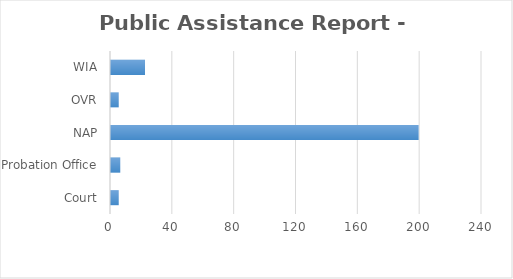
| Category | Series 0 |
|---|---|
| Court | 5 |
| Probation Office | 6 |
| NAP | 199 |
| OVR | 5 |
| WIA | 22 |